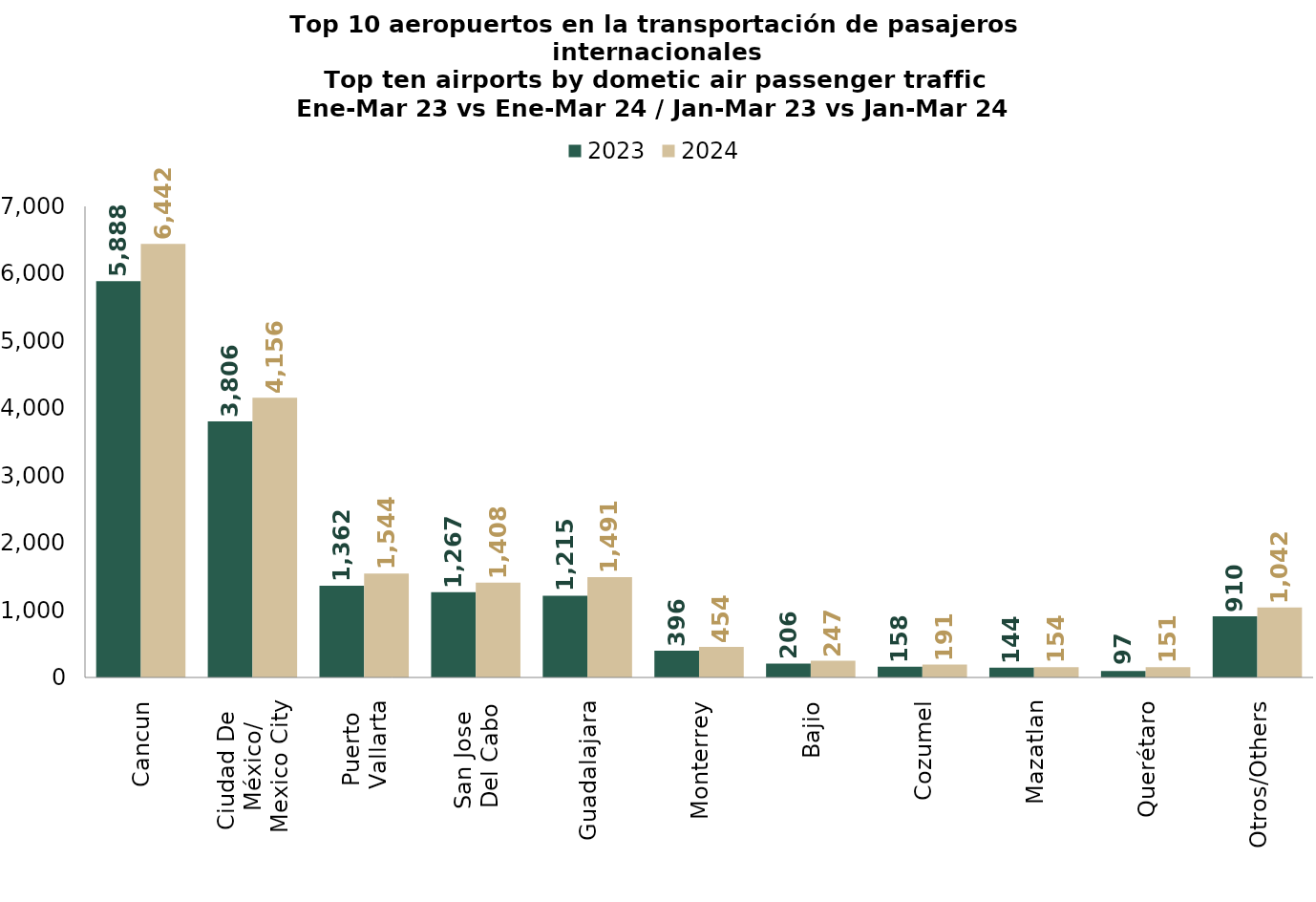
| Category | 2023 | 2024 |
|---|---|---|
| Cancun | 5888.218 | 6442.495 |
| Ciudad De 
México/
Mexico City | 3806.442 | 4156.015 |
| Puerto 
Vallarta | 1362.101 | 1544.134 |
| San Jose 
Del Cabo | 1266.768 | 1408.118 |
| Guadalajara | 1214.776 | 1490.558 |
| Monterrey | 396.471 | 454.287 |
| Bajio | 206.496 | 247.234 |
| Cozumel | 158.203 | 190.91 |
| Mazatlan | 143.814 | 153.919 |
| Querétaro | 96.937 | 151.271 |
| Otros/Others | 910.321 | 1041.807 |